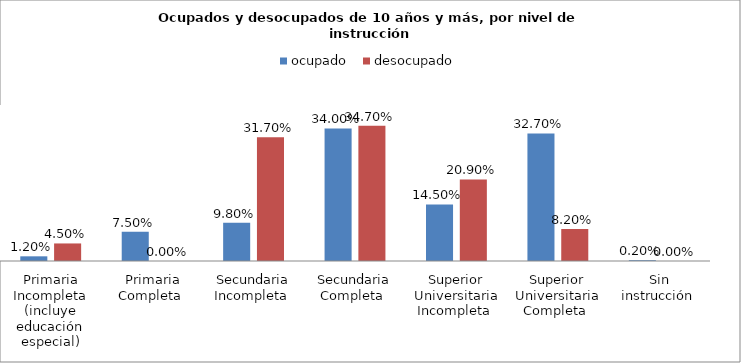
| Category | ocupado  | desocupado |
|---|---|---|
| Primaria Incompleta (incluye educación especial) | 0.012 | 0.045 |
| Primaria Completa  | 0.075 | 0 |
| Secundaria Incompleta  | 0.098 | 0.317 |
| Secundaria Completa  | 0.34 | 0.347 |
| Superior Universitaria Incompleta  | 0.145 | 0.209 |
| Superior Universitaria Completa  | 0.327 | 0.082 |
| Sin instrucción  | 0.002 | 0 |